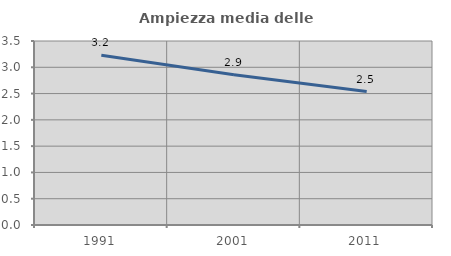
| Category | Ampiezza media delle famiglie |
|---|---|
| 1991.0 | 3.229 |
| 2001.0 | 2.86 |
| 2011.0 | 2.539 |